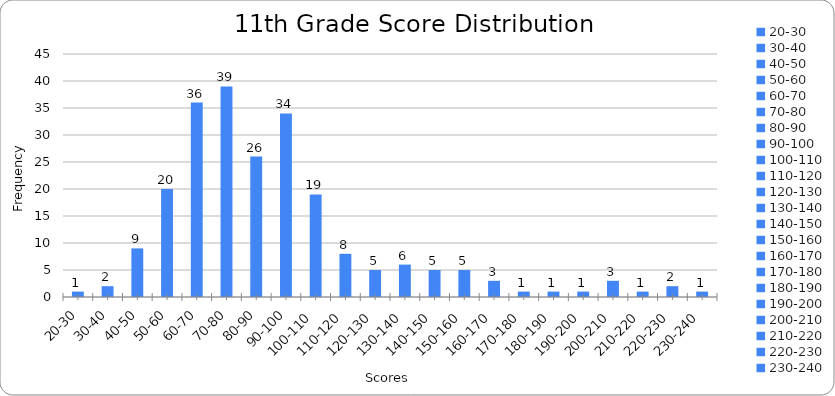
| Category | 0 |
|---|---|
| 20-30 | 1 |
| 30-40 | 2 |
| 40-50 | 9 |
| 50-60 | 20 |
| 60-70 | 36 |
| 70-80 | 39 |
| 80-90 | 26 |
| 90-100 | 34 |
| 100-110 | 19 |
| 110-120 | 8 |
| 120-130 | 5 |
| 130-140 | 6 |
| 140-150 | 5 |
| 150-160 | 5 |
| 160-170 | 3 |
| 170-180 | 1 |
| 180-190 | 1 |
| 190-200 | 1 |
| 200-210 | 3 |
| 210-220 | 1 |
| 220-230 | 2 |
| 230-240 | 1 |